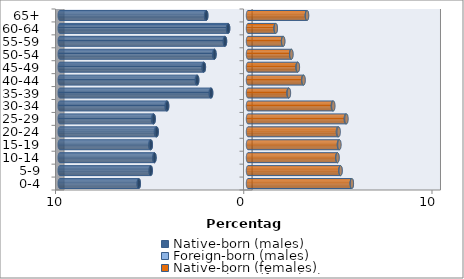
| Category | Native-born (males) | Foreign-born (males) | Native-born (females) | Foreign-born (females) |
|---|---|---|---|---|
| 0-4 | -5.801 | -0.003 | 5.514 | 0.003 |
| 5-9 | -5.167 | -0.004 | 4.913 | 0.004 |
| 10-14 | -4.969 | -0.006 | 4.748 | 0.006 |
| 15-19 | -5.162 | -0.031 | 4.83 | 0.028 |
| 20-24 | -4.849 | -0.042 | 4.779 | 0.04 |
| 25-29 | -5.009 | -0.037 | 5.2 | 0.033 |
| 30-34 | -4.297 | -0.029 | 4.51 | 0.024 |
| 35-39 | -1.959 | -0.026 | 2.155 | 0.02 |
| 40-44 | -2.699 | -0.023 | 2.936 | 0.017 |
| 45-49 | -2.343 | -0.02 | 2.634 | 0.016 |
| 50-54 | -1.78 | -0.017 | 2.293 | 0.014 |
| 55-59 | -1.221 | -0.012 | 1.862 | 0.01 |
| 60-64 | -1.055 | -0.007 | 1.469 | 0.006 |
| 65+ | -2.217 | -0.01 | 3.128 | 0.009 |